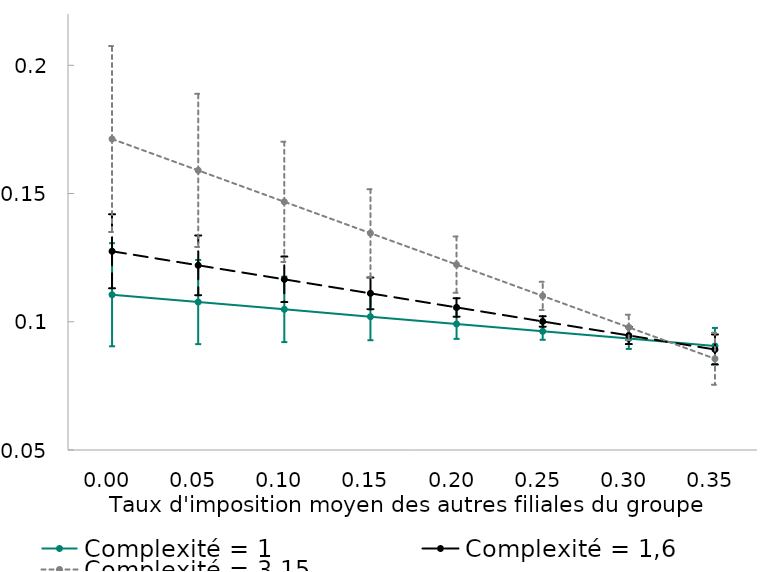
| Category | Complexité = 1 | Complexité = 1,6 | Complexité = 3,15 |
|---|---|---|---|
| 0.0 | 0.111 | 0.127 | 0.171 |
| 0.05 | 0.108 | 0.122 | 0.159 |
| 0.1 | 0.105 | 0.117 | 0.147 |
| 0.15 | 0.102 | 0.111 | 0.135 |
| 0.2 | 0.099 | 0.106 | 0.122 |
| 0.25 | 0.096 | 0.1 | 0.11 |
| 0.3 | 0.093 | 0.095 | 0.098 |
| 0.35 | 0.091 | 0.089 | 0.086 |